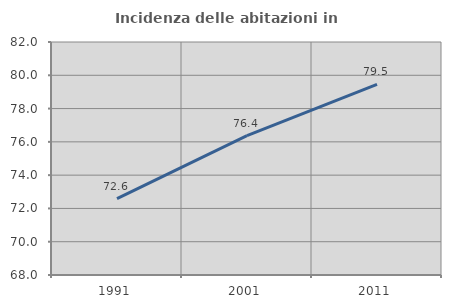
| Category | Incidenza delle abitazioni in proprietà  |
|---|---|
| 1991.0 | 72.589 |
| 2001.0 | 76.372 |
| 2011.0 | 79.452 |